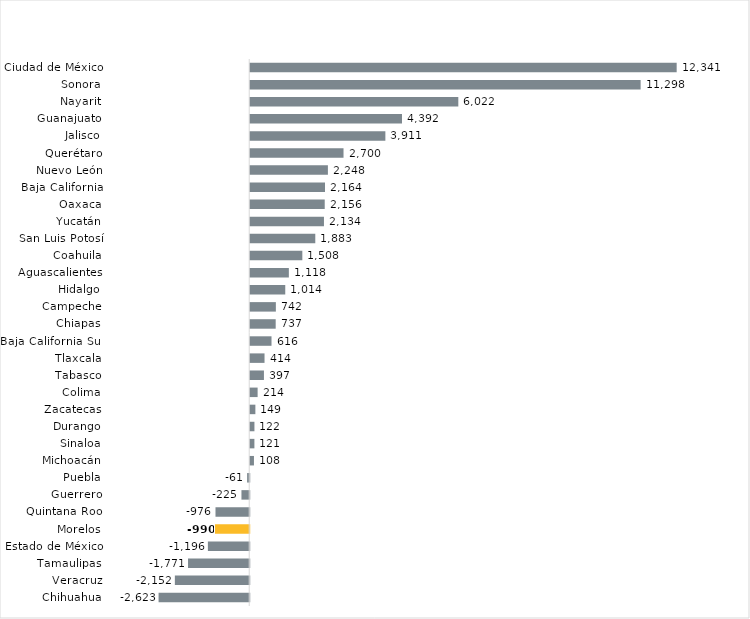
| Category | Series 0 |
|---|---|
| Chihuahua | -2623 |
| Veracruz | -2152 |
| Tamaulipas | -1771 |
| Estado de México | -1196 |
| Morelos | -990 |
| Quintana Roo | -976 |
| Guerrero | -225 |
| Puebla | -61 |
| Michoacán | 108 |
| Sinaloa | 121 |
| Durango | 122 |
| Zacatecas | 149 |
| Colima | 214 |
| Tabasco | 397 |
| Tlaxcala | 414 |
| Baja California Sur | 616 |
| Chiapas | 737 |
| Campeche | 742 |
| Hidalgo | 1014 |
| Aguascalientes | 1118 |
| Coahuila | 1508 |
| San Luis Potosí | 1883 |
| Yucatán | 2134 |
| Oaxaca | 2156 |
| Baja California | 2164 |
| Nuevo León | 2248 |
| Querétaro | 2700 |
| Jalisco | 3911 |
| Guanajuato | 4392 |
| Nayarit | 6022 |
| Sonora | 11298 |
| Ciudad de México | 12341 |